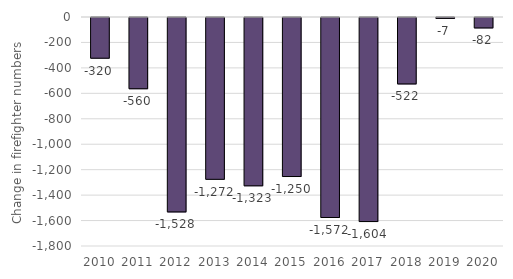
| Category | Firefighters |
|---|---|
| 2010 | -320 |
| 2011 | -560 |
| 2012 | -1528 |
| 2013 | -1272 |
| 2014 | -1323 |
| 2015 | -1250 |
| 2016 | -1572 |
| 2017 | -1604 |
| 2018 | -522 |
| 2019 | -7 |
| 2020 | -82 |